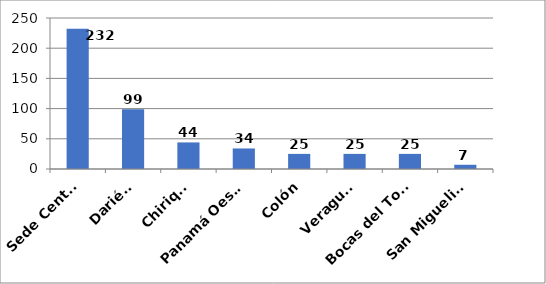
| Category | Series 0 |
|---|---|
| Sede Central | 232 |
| Darién  | 99 |
| Chiriquí | 44 |
| Panamá Oeste  | 34 |
| Colón | 25 |
| Veraguas  | 25 |
| Bocas del Toro  | 25 |
| San Miguelito  | 7 |